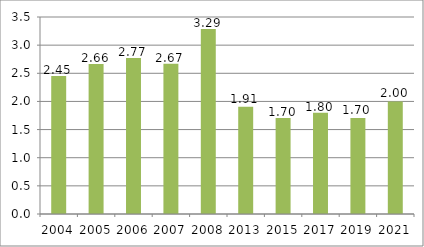
| Category | Glass Ceiling Index |
|---|---|
| 2004.0 | 2.45 |
| 2005.0 | 2.664 |
| 2006.0 | 2.773 |
| 2007.0 | 2.67 |
| 2008.0 | 3.287 |
| 2013.0 | 1.906 |
| 2015.0 | 1.704 |
| 2017.0 | 1.8 |
| 2019.0 | 1.704 |
| 2021.0 | 2 |